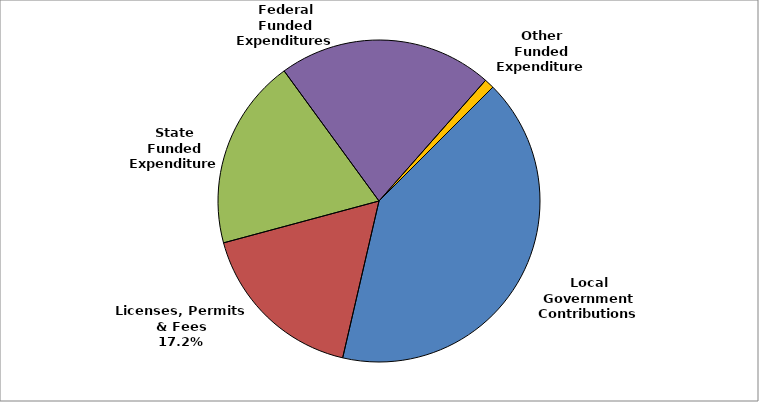
| Category | Series 0 |
|---|---|
| Local Government Contributions | 0.411 |
| Licenses, Permits & Fees | 0.172 |
| State Funded Expenditures | 0.192 |
| Federal Funded Expenditures | 0.215 |
| Other Funded Expenditures | 0.01 |